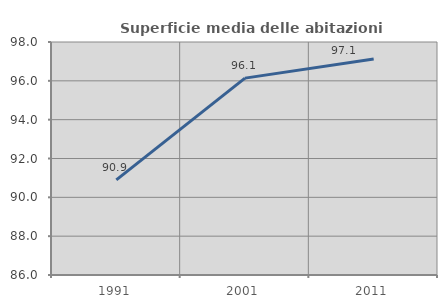
| Category | Superficie media delle abitazioni occupate |
|---|---|
| 1991.0 | 90.898 |
| 2001.0 | 96.139 |
| 2011.0 | 97.126 |